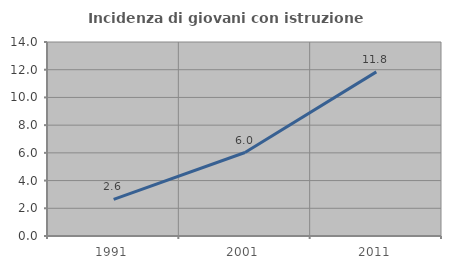
| Category | Incidenza di giovani con istruzione universitaria |
|---|---|
| 1991.0 | 2.649 |
| 2001.0 | 6.024 |
| 2011.0 | 11.842 |